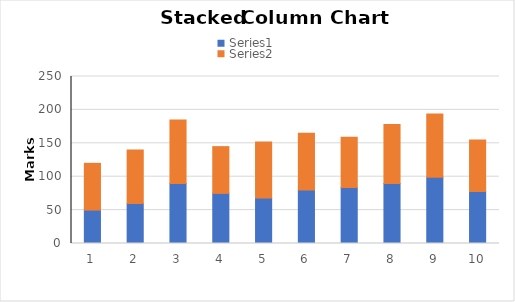
| Category | Series 0 | Series 1 |
|---|---|---|
| 0 | 50 | 70 |
| 1 | 60 | 80 |
| 2 | 90 | 95 |
| 3 | 75 | 70 |
| 4 | 68 | 84 |
| 5 | 80 | 85 |
| 6 | 84 | 75 |
| 7 | 90 | 88 |
| 8 | 99 | 95 |
| 9 | 78 | 77 |